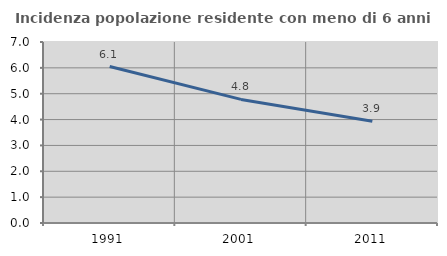
| Category | Incidenza popolazione residente con meno di 6 anni |
|---|---|
| 1991.0 | 6.052 |
| 2001.0 | 4.779 |
| 2011.0 | 3.932 |